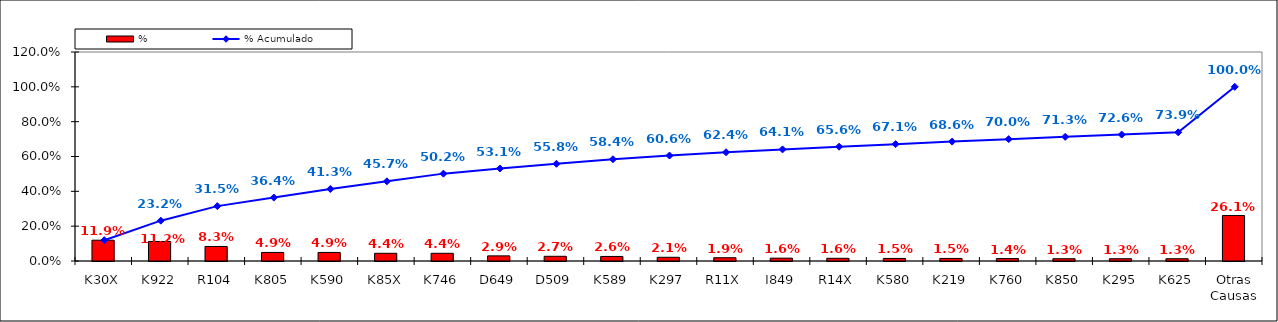
| Category | % |
|---|---|
| K30X | 0.119 |
| K922 | 0.112 |
| R104 | 0.083 |
| K805 | 0.049 |
| K590 | 0.049 |
| K85X | 0.044 |
| K746 | 0.044 |
| D649 | 0.029 |
| D509 | 0.027 |
| K589 | 0.026 |
| K297 | 0.021 |
| R11X | 0.019 |
| I849 | 0.016 |
| R14X | 0.016 |
| K580 | 0.015 |
| K219 | 0.015 |
| K760 | 0.014 |
| K850 | 0.013 |
| K295 | 0.013 |
| K625 | 0.013 |
| Otras Causas | 0.261 |